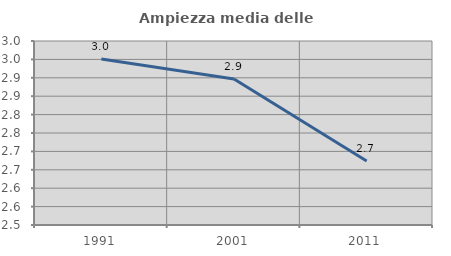
| Category | Ampiezza media delle famiglie |
|---|---|
| 1991.0 | 2.951 |
| 2001.0 | 2.897 |
| 2011.0 | 2.674 |